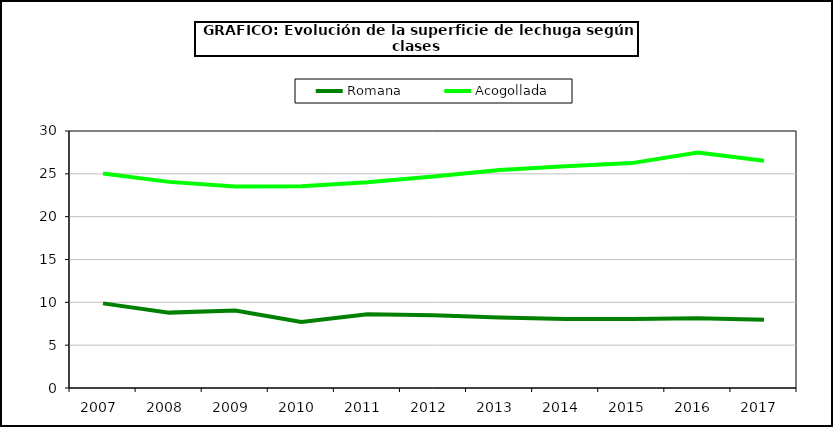
| Category | Romana | Acogollada |
|---|---|---|
| 2007.0 | 9.88 | 25.033 |
| 2008.0 | 8.799 | 24.061 |
| 2009.0 | 9.045 | 23.512 |
| 2010.0 | 7.707 | 23.549 |
| 2011.0 | 8.605 | 24.015 |
| 2012.0 | 8.497 | 24.699 |
| 2013.0 | 8.23 | 25.438 |
| 2014.0 | 8.041 | 25.883 |
| 2015.0 | 8.063 | 26.251 |
| 2016.0 | 8.145 | 27.501 |
| 2017.0 | 7.972 | 26.536 |